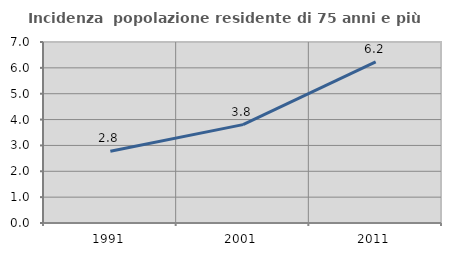
| Category | Incidenza  popolazione residente di 75 anni e più |
|---|---|
| 1991.0 | 2.772 |
| 2001.0 | 3.804 |
| 2011.0 | 6.227 |